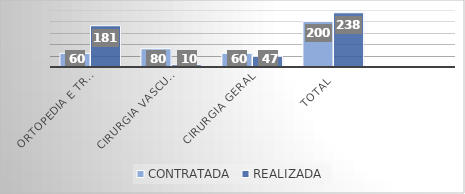
| Category | CONTRATADA | REALIZADA |
|---|---|---|
| Ortopedia e traumatologia | 60 | 181 |
| Cirurgia vascular | 80 | 10 |
| Cirurgia Geral | 60 | 47 |
| TOTAL | 200 | 238 |